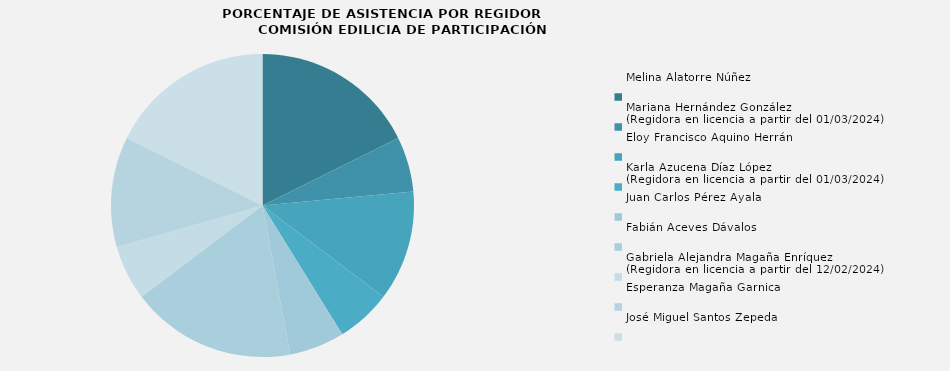
| Category | Melina Alatorre Núñez |
|---|---|
| Melina Alatorre Núñez | 100 |
| Mariana Hernández González
(Regidora en licencia a partir del 01/03/2024) | 33.333 |
| Eloy Francisco Aquino Herrán | 66.667 |
| Karla Azucena Díaz López
(Regidora en licencia a partir del 01/03/2024) | 33.333 |
| Juan Carlos Pérez Ayala | 33.333 |
| Fabián Aceves Dávalos | 100 |
| Gabriela Alejandra Magaña Enríquez
(Regidora en licencia a partir del 12/02/2024) | 33.333 |
| Esperanza Magaña Garnica | 66.667 |
| José Miguel Santos Zepeda | 100 |